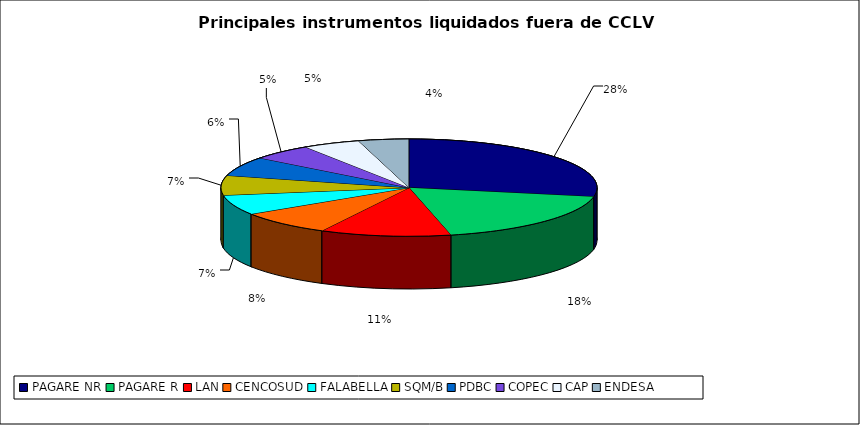
| Category | Series 0 |
|---|---|
| PAGARE NR | 1685 |
| PAGARE R | 1106 |
| LAN | 675 |
| CENCOSUD | 493 |
| FALABELLA | 399 |
| SQM/B | 394 |
| PDBC | 385 |
| COPEC | 317 |
| CAP | 296 |
| ENDESA | 261 |